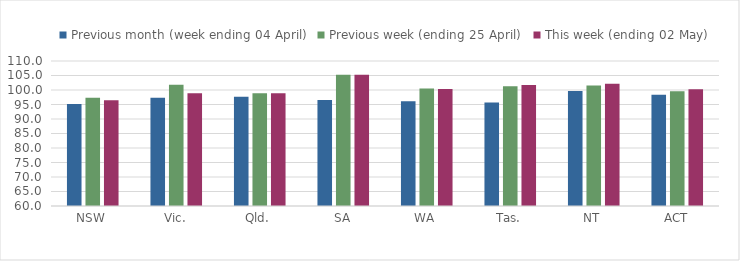
| Category | Previous month (week ending 04 April) | Previous week (ending 25 April) | This week (ending 02 May) |
|---|---|---|---|
| NSW | 95.13 | 97.31 | 96.423 |
| Vic. | 97.312 | 101.836 | 98.892 |
| Qld. | 97.689 | 98.881 | 98.881 |
| SA | 96.594 | 105.268 | 105.268 |
| WA | 96.162 | 100.544 | 100.334 |
| Tas. | 95.711 | 101.307 | 101.741 |
| NT | 99.623 | 101.519 | 102.194 |
| ACT | 98.397 | 99.581 | 100.289 |